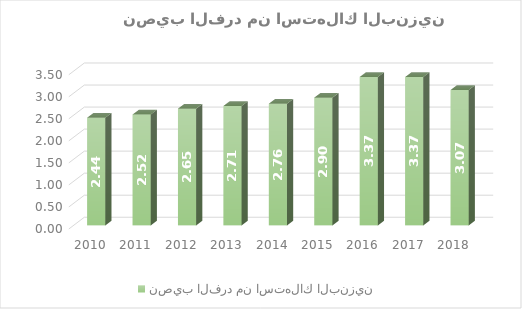
| Category | نصيب الفرد من استهلاك البنزين  |
|---|---|
| 2010.0 | 2.444 |
| 2011.0 | 2.517 |
| 2012.0 | 2.65 |
| 2013.0 | 2.711 |
| 2014.0 | 2.762 |
| 2015.0 | 2.9 |
| 2016.0 | 3.369 |
| 2017.0 | 3.368 |
| 2018.0 | 3.073 |